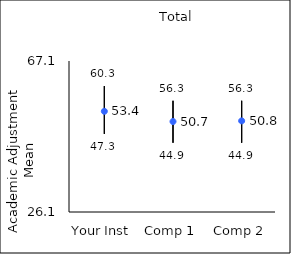
| Category | 25th percentile | 75th percentile | Mean |
|---|---|---|---|
| Your Inst | 47.3 | 60.3 | 53.44 |
| Comp 1 | 44.9 | 56.3 | 50.67 |
| Comp 2 | 44.9 | 56.3 | 50.84 |